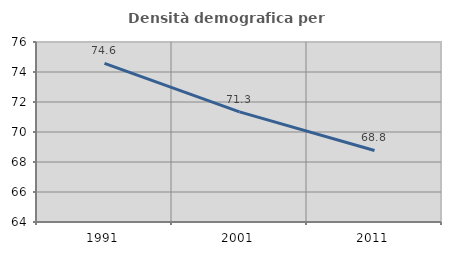
| Category | Densità demografica |
|---|---|
| 1991.0 | 74.57 |
| 2001.0 | 71.339 |
| 2011.0 | 68.77 |